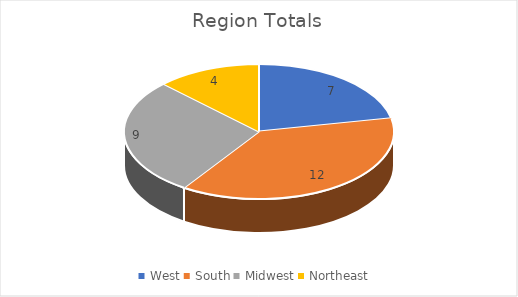
| Category | Totals |
|---|---|
| West | 7 |
| South | 12 |
| Midwest | 9 |
| Northeast | 4 |